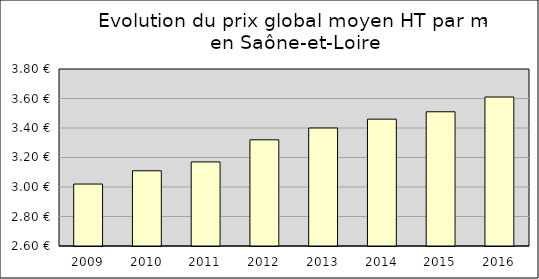
| Category | valeurs_prix_moyen |
|---|---|
| 2009.0 | 3.02 |
| 2010.0 | 3.11 |
| 2011.0 | 3.17 |
| 2012.0 | 3.32 |
| 2013.0 | 3.4 |
| 2014.0 | 3.46 |
| 2015.0 | 3.51 |
| 2016.0 | 3.61 |